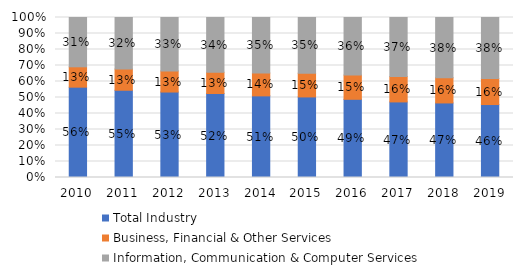
| Category | Total Industry | Business, Financial & Other Services | Information, Communication & Computer Services |
|---|---|---|---|
| 2010.0 | 0.565 | 0.127 | 0.308 |
| 2011.0 | 0.545 | 0.133 | 0.322 |
| 2012.0 | 0.534 | 0.132 | 0.334 |
| 2013.0 | 0.525 | 0.133 | 0.342 |
| 2014.0 | 0.51 | 0.143 | 0.347 |
| 2015.0 | 0.504 | 0.148 | 0.348 |
| 2016.0 | 0.489 | 0.151 | 0.36 |
| 2017.0 | 0.472 | 0.158 | 0.369 |
| 2018.0 | 0.466 | 0.158 | 0.376 |
| 2019.0 | 0.456 | 0.163 | 0.381 |